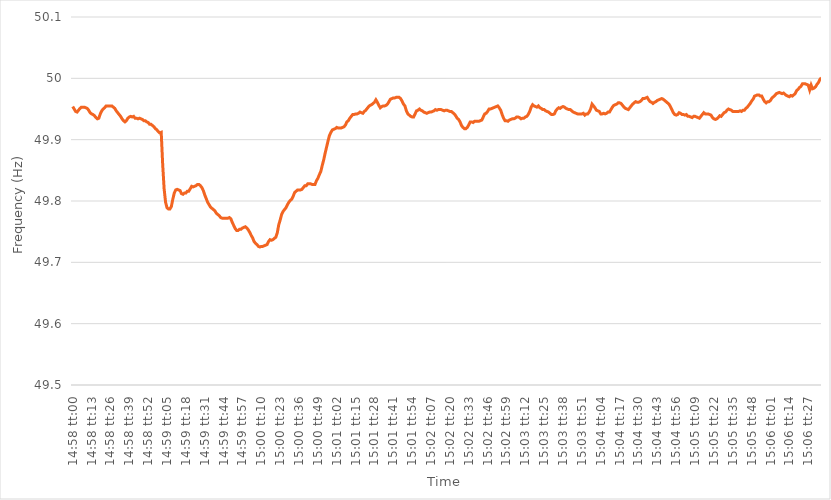
| Category | Series 0 |
|---|---|
| 0.6236111111111111 | 49.954 |
| 0.6236226851851852 | 49.95 |
| 0.6236342592592593 | 49.946 |
| 0.6236458333333333 | 49.945 |
| 0.6236574074074074 | 49.948 |
| 0.6236689814814814 | 49.951 |
| 0.6236805555555556 | 49.953 |
| 0.6236921296296296 | 49.953 |
| 0.6237037037037038 | 49.953 |
| 0.6237152777777778 | 49.952 |
| 0.6237268518518518 | 49.951 |
| 0.6237384259259259 | 49.948 |
| 0.62375 | 49.944 |
| 0.6237615740740741 | 49.942 |
| 0.6237731481481482 | 49.941 |
| 0.6237847222222223 | 49.939 |
| 0.6237962962962963 | 49.936 |
| 0.6238078703703703 | 49.934 |
| 0.6238194444444444 | 49.935 |
| 0.6238310185185185 | 49.942 |
| 0.6238425925925926 | 49.947 |
| 0.6238541666666667 | 49.95 |
| 0.6238657407407407 | 49.952 |
| 0.6238773148148148 | 49.955 |
| 0.6238888888888888 | 49.955 |
| 0.623900462962963 | 49.955 |
| 0.623912037037037 | 49.955 |
| 0.6239236111111112 | 49.955 |
| 0.6239351851851852 | 49.953 |
| 0.6239467592592592 | 49.951 |
| 0.6239583333333333 | 49.947 |
| 0.6239699074074074 | 49.944 |
| 0.6239814814814815 | 49.941 |
| 0.6239930555555556 | 49.938 |
| 0.6240046296296297 | 49.934 |
| 0.6240162037037037 | 49.931 |
| 0.6240277777777777 | 49.929 |
| 0.6240393518518519 | 49.931 |
| 0.6240509259259259 | 49.935 |
| 0.6240625 | 49.937 |
| 0.6240740740740741 | 49.938 |
| 0.6240856481481482 | 49.937 |
| 0.6240972222222222 | 49.938 |
| 0.6241087962962962 | 49.935 |
| 0.6241203703703704 | 49.935 |
| 0.6241319444444444 | 49.934 |
| 0.6241435185185186 | 49.935 |
| 0.6241550925925926 | 49.934 |
| 0.6241666666666666 | 49.933 |
| 0.6241782407407407 | 49.931 |
| 0.6241898148148148 | 49.931 |
| 0.6242013888888889 | 49.929 |
| 0.624212962962963 | 49.928 |
| 0.6242245370370371 | 49.925 |
| 0.6242361111111111 | 49.925 |
| 0.6242476851851851 | 49.923 |
| 0.6242592592592593 | 49.921 |
| 0.6242708333333333 | 49.918 |
| 0.6242824074074075 | 49.916 |
| 0.6242939814814815 | 49.913 |
| 0.6243055555555556 | 49.911 |
| 0.6243171296296296 | 49.912 |
| 0.6243287037037036 | 49.86 |
| 0.6243402777777778 | 49.82 |
| 0.6243518518518518 | 49.798 |
| 0.624363425925926 | 49.789 |
| 0.624375 | 49.787 |
| 0.624386574074074 | 49.787 |
| 0.6243981481481481 | 49.791 |
| 0.6244097222222222 | 49.803 |
| 0.6244212962962963 | 49.813 |
| 0.6244328703703704 | 49.818 |
| 0.6244444444444445 | 49.819 |
| 0.6244560185185185 | 49.818 |
| 0.6244675925925925 | 49.817 |
| 0.6244791666666667 | 49.812 |
| 0.6244907407407407 | 49.811 |
| 0.6245023148148149 | 49.813 |
| 0.6245138888888889 | 49.813 |
| 0.624525462962963 | 49.816 |
| 0.624537037037037 | 49.816 |
| 0.624548611111111 | 49.82 |
| 0.6245601851851852 | 49.824 |
| 0.6245717592592592 | 49.823 |
| 0.6245833333333334 | 49.824 |
| 0.6245949074074074 | 49.825 |
| 0.6246064814814815 | 49.827 |
| 0.6246180555555555 | 49.827 |
| 0.6246296296296296 | 49.825 |
| 0.6246412037037037 | 49.822 |
| 0.6246527777777778 | 49.817 |
| 0.6246643518518519 | 49.81 |
| 0.6246759259259259 | 49.804 |
| 0.6246875 | 49.798 |
| 0.6246990740740741 | 49.794 |
| 0.6247106481481481 | 49.79 |
| 0.6247222222222223 | 49.788 |
| 0.6247337962962963 | 49.786 |
| 0.6247453703703704 | 49.784 |
| 0.6247569444444444 | 49.78 |
| 0.6247685185185184 | 49.778 |
| 0.6247800925925926 | 49.776 |
| 0.6247916666666666 | 49.773 |
| 0.6248032407407408 | 49.772 |
| 0.6248148148148148 | 49.772 |
| 0.6248263888888889 | 49.772 |
| 0.6248379629629629 | 49.772 |
| 0.624849537037037 | 49.772 |
| 0.6248611111111111 | 49.773 |
| 0.6248726851851852 | 49.771 |
| 0.6248842592592593 | 49.765 |
| 0.6248958333333333 | 49.76 |
| 0.6249074074074074 | 49.755 |
| 0.6249189814814815 | 49.752 |
| 0.6249305555555555 | 49.752 |
| 0.6249421296296297 | 49.754 |
| 0.6249537037037037 | 49.754 |
| 0.6249652777777778 | 49.756 |
| 0.6249768518518518 | 49.757 |
| 0.624988425925926 | 49.758 |
| 0.625 | 49.756 |
| 0.625011574074074 | 49.753 |
| 0.6250231481481482 | 49.749 |
| 0.6250347222222222 | 49.744 |
| 0.6250462962962963 | 49.74 |
| 0.6250578703703703 | 49.734 |
| 0.6250694444444445 | 49.731 |
| 0.6250810185185185 | 49.729 |
| 0.6250925925925926 | 49.726 |
| 0.6251041666666667 | 49.725 |
| 0.6251157407407407 | 49.726 |
| 0.6251273148148148 | 49.726 |
| 0.6251388888888889 | 49.727 |
| 0.625150462962963 | 49.728 |
| 0.6251620370370371 | 49.729 |
| 0.6251736111111111 | 49.734 |
| 0.6251851851851852 | 49.737 |
| 0.6251967592592592 | 49.736 |
| 0.6252083333333334 | 49.737 |
| 0.6252199074074074 | 49.739 |
| 0.6252314814814816 | 49.741 |
| 0.6252430555555556 | 49.748 |
| 0.6252546296296296 | 49.761 |
| 0.6252662037037037 | 49.769 |
| 0.6252777777777777 | 49.778 |
| 0.6252893518518519 | 49.783 |
| 0.6253009259259259 | 49.786 |
| 0.6253125 | 49.789 |
| 0.6253240740740741 | 49.794 |
| 0.6253356481481481 | 49.798 |
| 0.6253472222222222 | 49.801 |
| 0.6253587962962963 | 49.803 |
| 0.6253703703703704 | 49.808 |
| 0.6253819444444445 | 49.814 |
| 0.6253935185185185 | 49.816 |
| 0.6254050925925926 | 49.818 |
| 0.6254166666666666 | 49.818 |
| 0.6254282407407408 | 49.818 |
| 0.6254398148148148 | 49.819 |
| 0.625451388888889 | 49.822 |
| 0.625462962962963 | 49.825 |
| 0.625474537037037 | 49.825 |
| 0.6254861111111111 | 49.828 |
| 0.6254976851851851 | 49.828 |
| 0.6255092592592593 | 49.828 |
| 0.6255208333333333 | 49.827 |
| 0.6255324074074075 | 49.827 |
| 0.6255439814814815 | 49.827 |
| 0.6255555555555555 | 49.833 |
| 0.6255671296296296 | 49.837 |
| 0.6255787037037037 | 49.843 |
| 0.6255902777777778 | 49.848 |
| 0.6256018518518519 | 49.858 |
| 0.625613425925926 | 49.867 |
| 0.625625 | 49.878 |
| 0.625636574074074 | 49.888 |
| 0.6256481481481482 | 49.898 |
| 0.6256597222222222 | 49.907 |
| 0.6256712962962964 | 49.912 |
| 0.6256828703703704 | 49.916 |
| 0.6256944444444444 | 49.917 |
| 0.6257060185185185 | 49.918 |
| 0.6257175925925925 | 49.92 |
| 0.6257291666666667 | 49.919 |
| 0.6257407407407407 | 49.919 |
| 0.6257523148148149 | 49.919 |
| 0.6257638888888889 | 49.92 |
| 0.6257754629629629 | 49.921 |
| 0.625787037037037 | 49.924 |
| 0.6257986111111111 | 49.929 |
| 0.6258101851851852 | 49.931 |
| 0.6258217592592593 | 49.935 |
| 0.6258333333333334 | 49.938 |
| 0.6258449074074074 | 49.941 |
| 0.6258564814814814 | 49.941 |
| 0.6258680555555556 | 49.942 |
| 0.6258796296296296 | 49.942 |
| 0.6258912037037038 | 49.943 |
| 0.6259027777777778 | 49.945 |
| 0.6259143518518518 | 49.944 |
| 0.6259259259259259 | 49.943 |
| 0.6259375 | 49.946 |
| 0.6259490740740741 | 49.948 |
| 0.6259606481481481 | 49.951 |
| 0.6259722222222223 | 49.954 |
| 0.6259837962962963 | 49.956 |
| 0.6259953703703703 | 49.957 |
| 0.6260069444444444 | 49.959 |
| 0.6260185185185185 | 49.961 |
| 0.6260300925925926 | 49.965 |
| 0.6260416666666667 | 49.961 |
| 0.6260532407407408 | 49.956 |
| 0.6260648148148148 | 49.952 |
| 0.6260763888888888 | 49.954 |
| 0.626087962962963 | 49.955 |
| 0.626099537037037 | 49.955 |
| 0.6261111111111112 | 49.956 |
| 0.6261226851851852 | 49.958 |
| 0.6261342592592593 | 49.962 |
| 0.6261458333333333 | 49.966 |
| 0.6261574074074074 | 49.967 |
| 0.6261689814814815 | 49.968 |
| 0.6261805555555556 | 49.968 |
| 0.6261921296296297 | 49.969 |
| 0.6262037037037037 | 49.969 |
| 0.6262152777777777 | 49.969 |
| 0.6262268518518518 | 49.967 |
| 0.6262384259259259 | 49.963 |
| 0.62625 | 49.958 |
| 0.6262615740740741 | 49.955 |
| 0.6262731481481482 | 49.947 |
| 0.6262847222222222 | 49.942 |
| 0.6262962962962962 | 49.94 |
| 0.6263078703703704 | 49.938 |
| 0.6263194444444444 | 49.937 |
| 0.6263310185185186 | 49.937 |
| 0.6263425925925926 | 49.942 |
| 0.6263541666666667 | 49.947 |
| 0.6263657407407407 | 49.948 |
| 0.6263773148148148 | 49.95 |
| 0.6263888888888889 | 49.948 |
| 0.626400462962963 | 49.947 |
| 0.6264120370370371 | 49.945 |
| 0.6264236111111111 | 49.944 |
| 0.6264351851851852 | 49.943 |
| 0.6264467592592592 | 49.944 |
| 0.6264583333333333 | 49.945 |
| 0.6264699074074074 | 49.945 |
| 0.6264814814814815 | 49.946 |
| 0.6264930555555556 | 49.947 |
| 0.6265046296296296 | 49.949 |
| 0.6265162037037036 | 49.948 |
| 0.6265277777777778 | 49.949 |
| 0.6265393518518518 | 49.949 |
| 0.626550925925926 | 49.949 |
| 0.6265625 | 49.948 |
| 0.6265740740740741 | 49.947 |
| 0.6265856481481481 | 49.948 |
| 0.6265972222222222 | 49.948 |
| 0.6266087962962963 | 49.947 |
| 0.6266203703703704 | 49.946 |
| 0.6266319444444445 | 49.946 |
| 0.6266435185185185 | 49.944 |
| 0.6266550925925926 | 49.942 |
| 0.6266666666666666 | 49.939 |
| 0.6266782407407407 | 49.935 |
| 0.6266898148148148 | 49.933 |
| 0.6267013888888889 | 49.929 |
| 0.626712962962963 | 49.923 |
| 0.626724537037037 | 49.92 |
| 0.626736111111111 | 49.918 |
| 0.6267476851851852 | 49.918 |
| 0.6267592592592592 | 49.92 |
| 0.6267708333333334 | 49.924 |
| 0.6267824074074074 | 49.929 |
| 0.6267939814814815 | 49.929 |
| 0.6268055555555555 | 49.928 |
| 0.6268171296296297 | 49.93 |
| 0.6268287037037037 | 49.93 |
| 0.6268402777777778 | 49.93 |
| 0.6268518518518519 | 49.93 |
| 0.6268634259259259 | 49.931 |
| 0.626875 | 49.932 |
| 0.6268865740740741 | 49.937 |
| 0.6268981481481481 | 49.942 |
| 0.6269097222222222 | 49.943 |
| 0.6269212962962963 | 49.946 |
| 0.6269328703703704 | 49.95 |
| 0.6269444444444444 | 49.95 |
| 0.6269560185185185 | 49.951 |
| 0.6269675925925926 | 49.952 |
| 0.6269791666666666 | 49.953 |
| 0.6269907407407408 | 49.954 |
| 0.6270023148148148 | 49.955 |
| 0.6270138888888889 | 49.952 |
| 0.6270254629629629 | 49.948 |
| 0.6270370370370371 | 49.941 |
| 0.6270486111111111 | 49.935 |
| 0.6270601851851852 | 49.931 |
| 0.6270717592592593 | 49.931 |
| 0.6270833333333333 | 49.93 |
| 0.6270949074074074 | 49.932 |
| 0.6271064814814815 | 49.933 |
| 0.6271180555555556 | 49.934 |
| 0.6271296296296297 | 49.934 |
| 0.6271412037037037 | 49.935 |
| 0.6271527777777778 | 49.937 |
| 0.6271643518518518 | 49.937 |
| 0.6271759259259259 | 49.936 |
| 0.6271875 | 49.934 |
| 0.627199074074074 | 49.935 |
| 0.6272106481481482 | 49.935 |
| 0.6272222222222222 | 49.937 |
| 0.6272337962962963 | 49.938 |
| 0.6272453703703703 | 49.941 |
| 0.6272569444444445 | 49.946 |
| 0.6272685185185185 | 49.953 |
| 0.6272800925925927 | 49.957 |
| 0.6272916666666667 | 49.955 |
| 0.6273032407407407 | 49.954 |
| 0.6273148148148148 | 49.953 |
| 0.6273263888888889 | 49.955 |
| 0.627337962962963 | 49.952 |
| 0.6273495370370371 | 49.951 |
| 0.6273611111111111 | 49.949 |
| 0.6273726851851852 | 49.949 |
| 0.6273842592592592 | 49.947 |
| 0.6273958333333333 | 49.946 |
| 0.6274074074074074 | 49.945 |
| 0.6274189814814815 | 49.943 |
| 0.6274305555555556 | 49.941 |
| 0.6274421296296296 | 49.941 |
| 0.6274537037037037 | 49.942 |
| 0.6274652777777777 | 49.947 |
| 0.6274768518518519 | 49.95 |
| 0.6274884259259259 | 49.952 |
| 0.6275000000000001 | 49.951 |
| 0.6275115740740741 | 49.953 |
| 0.6275231481481481 | 49.954 |
| 0.6275347222222222 | 49.953 |
| 0.6275462962962963 | 49.951 |
| 0.6275578703703704 | 49.95 |
| 0.6275694444444445 | 49.949 |
| 0.6275810185185186 | 49.949 |
| 0.6275925925925926 | 49.947 |
| 0.6276041666666666 | 49.945 |
| 0.6276157407407407 | 49.944 |
| 0.6276273148148148 | 49.943 |
| 0.6276388888888889 | 49.942 |
| 0.627650462962963 | 49.942 |
| 0.627662037037037 | 49.942 |
| 0.6276736111111111 | 49.942 |
| 0.6276851851851851 | 49.943 |
| 0.6276967592592593 | 49.94 |
| 0.6277083333333333 | 49.942 |
| 0.6277199074074075 | 49.942 |
| 0.6277314814814815 | 49.945 |
| 0.6277430555555555 | 49.95 |
| 0.6277546296296296 | 49.958 |
| 0.6277662037037037 | 49.955 |
| 0.6277777777777778 | 49.952 |
| 0.6277893518518519 | 49.948 |
| 0.627800925925926 | 49.947 |
| 0.6278125 | 49.946 |
| 0.627824074074074 | 49.942 |
| 0.6278356481481482 | 49.942 |
| 0.6278472222222222 | 49.943 |
| 0.6278587962962963 | 49.942 |
| 0.6278703703703704 | 49.943 |
| 0.6278819444444445 | 49.945 |
| 0.6278935185185185 | 49.945 |
| 0.6279050925925925 | 49.949 |
| 0.6279166666666667 | 49.953 |
| 0.6279282407407407 | 49.956 |
| 0.6279398148148149 | 49.957 |
| 0.6279513888888889 | 49.958 |
| 0.627962962962963 | 49.96 |
| 0.627974537037037 | 49.96 |
| 0.6279861111111111 | 49.959 |
| 0.6279976851851852 | 49.956 |
| 0.6280092592592593 | 49.953 |
| 0.6280208333333334 | 49.951 |
| 0.6280324074074074 | 49.95 |
| 0.6280439814814814 | 49.949 |
| 0.6280555555555556 | 49.952 |
| 0.6280671296296296 | 49.955 |
| 0.6280787037037037 | 49.958 |
| 0.6280902777777778 | 49.96 |
| 0.6281018518518519 | 49.962 |
| 0.6281134259259259 | 49.961 |
| 0.6281249999999999 | 49.961 |
| 0.6281365740740741 | 49.962 |
| 0.6281481481481481 | 49.964 |
| 0.6281597222222223 | 49.967 |
| 0.6281712962962963 | 49.967 |
| 0.6281828703703703 | 49.968 |
| 0.6281944444444444 | 49.969 |
| 0.6282060185185185 | 49.965 |
| 0.6282175925925926 | 49.962 |
| 0.6282291666666667 | 49.961 |
| 0.6282407407407408 | 49.959 |
| 0.6282523148148148 | 49.961 |
| 0.6282638888888888 | 49.962 |
| 0.628275462962963 | 49.964 |
| 0.628287037037037 | 49.965 |
| 0.6282986111111112 | 49.966 |
| 0.6283101851851852 | 49.967 |
| 0.6283217592592593 | 49.966 |
| 0.6283333333333333 | 49.964 |
| 0.6283449074074073 | 49.962 |
| 0.6283564814814815 | 49.96 |
| 0.6283680555555555 | 49.958 |
| 0.6283796296296297 | 49.954 |
| 0.6283912037037037 | 49.949 |
| 0.6284027777777778 | 49.944 |
| 0.6284143518518518 | 49.941 |
| 0.6284259259259259 | 49.94 |
| 0.6284375 | 49.941 |
| 0.6284490740740741 | 49.944 |
| 0.6284606481481482 | 49.943 |
| 0.6284722222222222 | 49.941 |
| 0.6284837962962962 | 49.941 |
| 0.6284953703703704 | 49.94 |
| 0.6285069444444444 | 49.941 |
| 0.6285185185185186 | 49.938 |
| 0.6285300925925926 | 49.938 |
| 0.6285416666666667 | 49.937 |
| 0.6285532407407407 | 49.936 |
| 0.6285648148148147 | 49.938 |
| 0.6285763888888889 | 49.938 |
| 0.6285879629629629 | 49.937 |
| 0.6285995370370371 | 49.936 |
| 0.6286111111111111 | 49.935 |
| 0.6286226851851852 | 49.938 |
| 0.6286342592592592 | 49.941 |
| 0.6286458333333333 | 49.944 |
| 0.6286574074074074 | 49.942 |
| 0.6286689814814815 | 49.942 |
| 0.6286805555555556 | 49.942 |
| 0.6286921296296296 | 49.941 |
| 0.6287037037037037 | 49.94 |
| 0.6287152777777778 | 49.936 |
| 0.6287268518518518 | 49.934 |
| 0.628738425925926 | 49.933 |
| 0.62875 | 49.934 |
| 0.6287615740740741 | 49.936 |
| 0.6287731481481481 | 49.939 |
| 0.6287847222222223 | 49.938 |
| 0.6287962962962963 | 49.941 |
| 0.6288078703703703 | 49.944 |
| 0.6288194444444445 | 49.945 |
| 0.6288310185185185 | 49.948 |
| 0.6288425925925926 | 49.95 |
| 0.6288541666666666 | 49.949 |
| 0.6288657407407408 | 49.948 |
| 0.6288773148148148 | 49.946 |
| 0.6288888888888889 | 49.946 |
| 0.628900462962963 | 49.946 |
| 0.628912037037037 | 49.946 |
| 0.6289236111111111 | 49.946 |
| 0.6289351851851852 | 49.947 |
| 0.6289467592592592 | 49.946 |
| 0.6289583333333334 | 49.948 |
| 0.6289699074074074 | 49.948 |
| 0.6289814814814815 | 49.951 |
| 0.6289930555555555 | 49.953 |
| 0.6290046296296297 | 49.956 |
| 0.6290162037037037 | 49.959 |
| 0.6290277777777777 | 49.963 |
| 0.6290393518518519 | 49.966 |
| 0.6290509259259259 | 49.971 |
| 0.6290625 | 49.972 |
| 0.629074074074074 | 49.973 |
| 0.6290856481481482 | 49.973 |
| 0.6290972222222222 | 49.971 |
| 0.6291087962962963 | 49.971 |
| 0.6291203703703704 | 49.966 |
| 0.6291319444444444 | 49.962 |
| 0.6291435185185185 | 49.96 |
| 0.6291550925925926 | 49.962 |
| 0.6291666666666667 | 49.962 |
| 0.6291782407407408 | 49.964 |
| 0.6291898148148148 | 49.968 |
| 0.6292013888888889 | 49.97 |
| 0.6292129629629629 | 49.972 |
| 0.6292245370370371 | 49.975 |
| 0.6292361111111111 | 49.976 |
| 0.6292476851851853 | 49.977 |
| 0.6292592592592593 | 49.976 |
| 0.6292708333333333 | 49.975 |
| 0.6292824074074074 | 49.976 |
| 0.6292939814814814 | 49.974 |
| 0.6293055555555556 | 49.972 |
| 0.6293171296296296 | 49.971 |
| 0.6293287037037038 | 49.97 |
| 0.6293402777777778 | 49.972 |
| 0.6293518518518518 | 49.971 |
| 0.6293634259259259 | 49.973 |
| 0.629375 | 49.975 |
| 0.6293865740740741 | 49.98 |
| 0.6293981481481482 | 49.982 |
| 0.6294097222222222 | 49.985 |
| 0.6294212962962963 | 49.987 |
| 0.6294328703703703 | 49.991 |
| 0.6294444444444445 | 49.991 |
| 0.6294560185185185 | 49.991 |
| 0.6294675925925927 | 49.99 |
| 0.6294791666666667 | 49.989 |
| 0.6294907407407407 | 49.981 |
| 0.6295023148148148 | 49.989 |
| 0.6295138888888888 | 49.983 |
| 0.629525462962963 | 49.984 |
| 0.629537037037037 | 49.986 |
| 0.6295486111111112 | 49.99 |
| 0.6295601851851852 | 49.993 |
| 0.6295717592592592 | 49.998 |
| 0.6295833333333333 | 50.001 |